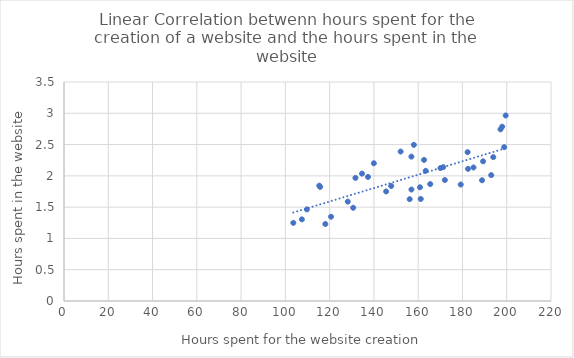
| Category | Hours spent in the website |
|---|---|
| 158.0393497087358 | 2.495 |
| 197.18368301107745 | 2.743 |
| 120.6267872032713 | 1.347 |
| 107.45706395929709 | 1.305 |
| 179.22108951652507 | 1.861 |
| 165.44176124913875 | 1.868 |
| 131.6599789267661 | 1.967 |
| 193.00194245721792 | 2.012 |
| 160.81132412327787 | 1.818 |
| 147.7991747498799 | 1.838 |
| 163.39441093398736 | 2.08 |
| 199.51393474413348 | 2.965 |
| 162.6412100919973 | 2.255 |
| 156.93959984362283 | 2.308 |
| 193.91723166223022 | 2.299 |
| 137.33521281763842 | 1.983 |
| 118.06613726047772 | 1.23 |
| 134.62302632868008 | 2.036 |
| 115.3178192520628 | 1.843 |
| 156.95848199328927 | 1.782 |
| 145.52341527178203 | 1.751 |
| 115.70938148625876 | 1.824 |
| 152.06332842624658 | 2.389 |
| 109.71762786574446 | 1.464 |
| 198.8513243328222 | 2.459 |
| 182.51898096335182 | 2.112 |
| 103.59558120203228 | 1.249 |
| 156.15448777787606 | 1.628 |
| 182.3210532741488 | 2.379 |
| 161.15973473355766 | 1.631 |
| 172.05368508572997 | 1.933 |
| 128.19146462486268 | 1.588 |
| 197.9401634892924 | 2.785 |
| 171.2924069035197 | 2.139 |
| 184.99043136940531 | 2.134 |
| 139.9827356425667 | 2.202 |
| 170.06463760161301 | 2.125 |
| 189.31363626791403 | 2.232 |
| 188.84420571332458 | 1.929 |
| 130.63267537035736 | 1.49 |